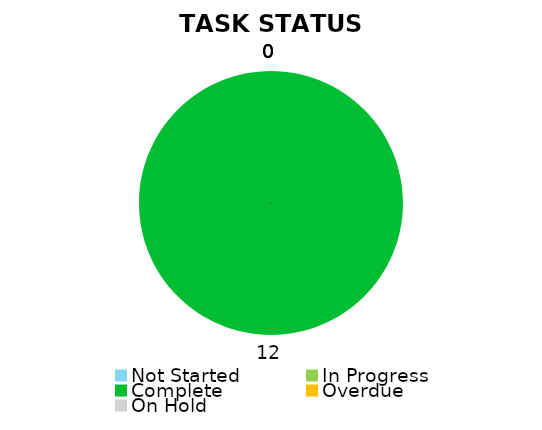
| Category | Series 1 | Series 0 |
|---|---|---|
| Not Started | 0 | 0 |
| In Progress | 0 | 0 |
| Complete | 12 | 12 |
| Overdue | 0 | 0 |
| On Hold | 0 | 0 |